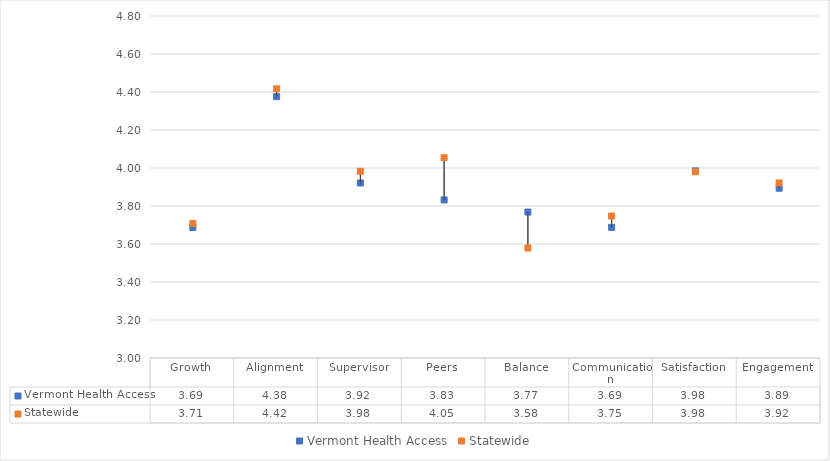
| Category | Vermont Health Access | Statewide |
|---|---|---|
| Growth | 3.687 | 3.708 |
| Alignment | 4.375 | 4.417 |
| Supervisor | 3.921 | 3.983 |
| Peers | 3.832 | 4.054 |
| Balance | 3.768 | 3.579 |
| Communication | 3.687 | 3.747 |
| Satisfaction | 3.985 | 3.98 |
| Engagement | 3.894 | 3.921 |